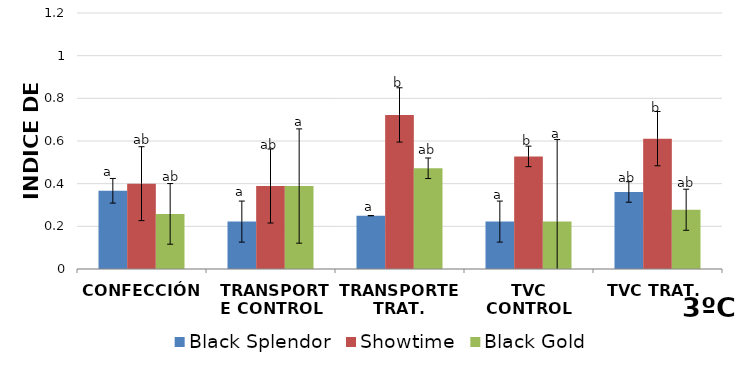
| Category | Black Splendor | Showtime | Black Gold |
|---|---|---|---|
| CONFECCIÓN | 0.367 | 0.4 | 0.258 |
|  TRANSPORTE CONTROL | 0.222 | 0.389 | 0.389 |
| TRANSPORTE TRAT. | 0.25 | 0.722 | 0.472 |
| TVC CONTROL | 0.222 | 0.528 | 0.222 |
| TVC TRAT. | 0.361 | 0.611 | 0.278 |